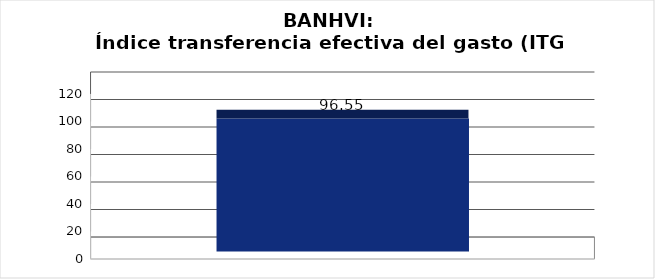
| Category | Índice transferencia efectiva del gasto (ITG) |
|---|---|
|  | 96.555 |